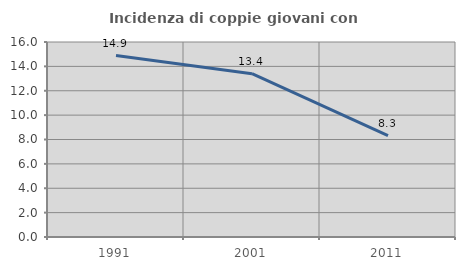
| Category | Incidenza di coppie giovani con figli |
|---|---|
| 1991.0 | 14.888 |
| 2001.0 | 13.4 |
| 2011.0 | 8.313 |